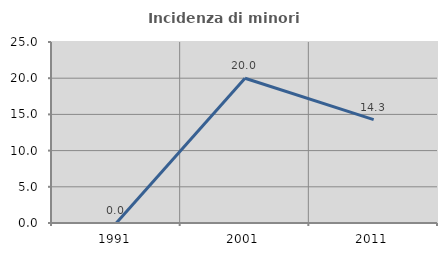
| Category | Incidenza di minori stranieri |
|---|---|
| 1991.0 | 0 |
| 2001.0 | 20 |
| 2011.0 | 14.286 |